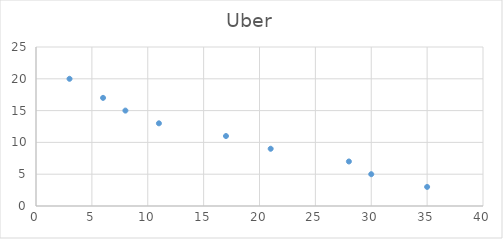
| Category | Uber |
|---|---|
| 35.0 | 3 |
| 30.0 | 5 |
| 28.0 | 7 |
| 21.0 | 9 |
| 17.0 | 11 |
| 11.0 | 13 |
| 8.0 | 15 |
| 6.0 | 17 |
| 3.0 | 20 |